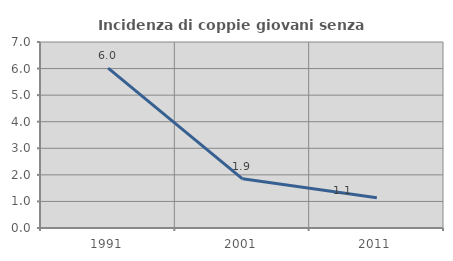
| Category | Incidenza di coppie giovani senza figli |
|---|---|
| 1991.0 | 6.015 |
| 2001.0 | 1.852 |
| 2011.0 | 1.136 |